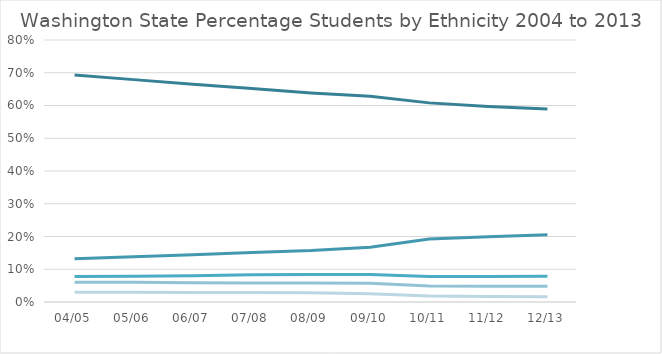
| Category | American Indian | Black | Asian | Hispanic | White |
|---|---|---|---|---|---|
| 04/05 | 0.03 | 0.06 | 0.078 | 0.132 | 0.693 |
| 05/06 | 0.03 | 0.06 | 0.079 | 0.138 | 0.679 |
| 06/07 | 0.029 | 0.059 | 0.08 | 0.144 | 0.665 |
| 07/08 | 0.029 | 0.058 | 0.083 | 0.151 | 0.652 |
| 08/09 | 0.028 | 0.058 | 0.084 | 0.157 | 0.638 |
| 09/10 | 0.025 | 0.057 | 0.084 | 0.167 | 0.628 |
| 10/11 | 0.018 | 0.049 | 0.078 | 0.192 | 0.608 |
| 11/12 | 0.017 | 0.048 | 0.078 | 0.199 | 0.597 |
| 12/13 | 0.016 | 0.048 | 0.079 | 0.205 | 0.589 |